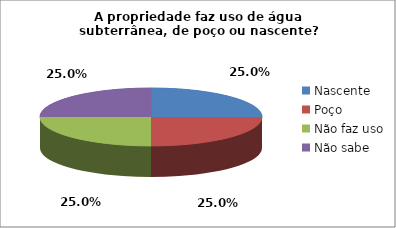
| Category | Series 0 |
|---|---|
| Nascente | 0.25 |
| Poço | 0.25 |
| Não faz uso | 0.25 |
| Não sabe | 0.25 |